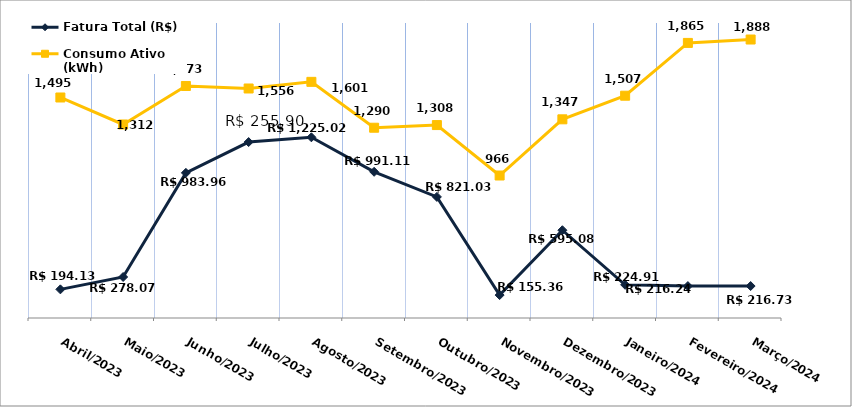
| Category | Fatura Total (R$) |
|---|---|
| Abril/2023 | 194.13 |
| Maio/2023 | 278.07 |
| Junho/2023 | 983.96 |
| Julho/2023 | 1192.72 |
| Agosto/2023 | 1225.02 |
| Setembro/2023 | 991.11 |
| Outubro/2023 | 821.03 |
| Novembro/2023 | 155.36 |
| Dezembro/2023 | 595.08 |
| Janeiro/2024 | 224.91 |
| Fevereiro/2024 | 216.24 |
| Março/2024 | 216.73 |